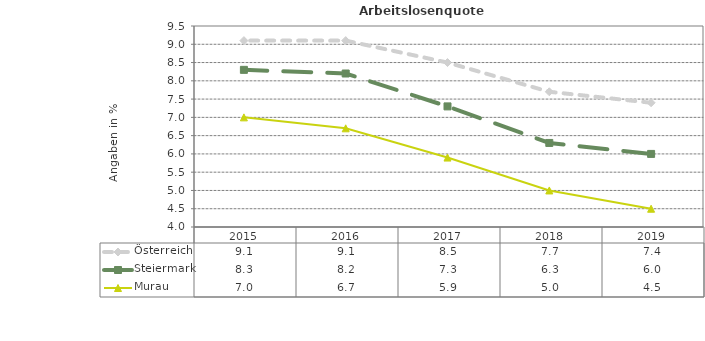
| Category | Österreich | Steiermark | Murau |
|---|---|---|---|
| 2019.0 | 7.4 | 6 | 4.5 |
| 2018.0 | 7.7 | 6.3 | 5 |
| 2017.0 | 8.5 | 7.3 | 5.9 |
| 2016.0 | 9.1 | 8.2 | 6.7 |
| 2015.0 | 9.1 | 8.3 | 7 |